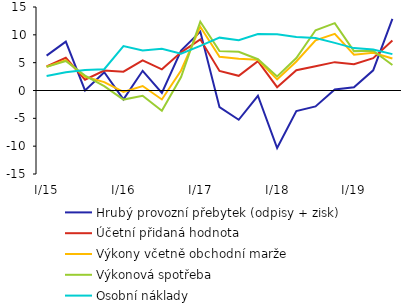
| Category | Hrubý provozní přebytek (odpisy + zisk)   | Účetní přidaná hodnota | Výkony včetně obchodní marže | Výkonová spotřeba | Osobní náklady |
|---|---|---|---|---|---|
|  I/15 | 6.258 | 4.33 | 4.267 | 4.242 | 2.6 |
|  II | 8.779 | 5.885 | 5.463 | 5.302 | 3.274 |
| III | 0.02 | 1.943 | 2.472 | 2.674 | 3.683 |
| IV | 3.287 | 3.585 | 1.515 | 0.78 | 3.819 |
|  I/16 | -1.596 | 3.373 | -0.248 | -1.632 | 7.994 |
| II | 3.541 | 5.412 | 0.805 | -0.957 | 7.192 |
| III | -0.43 | 3.809 | -1.61 | -3.654 | 7.507 |
| IV | 7.176 | 6.856 | 3.599 | 2.411 | 6.605 |
|  I/17 | 10.577 | 9.191 | 11.446 | 12.351 | 8.017 |
| II | -2.998 | 3.514 | 6.043 | 7.072 | 9.495 |
| III | -5.256 | 2.64 | 5.707 | 6.955 | 9.023 |
| IV | -0.947 | 5.258 | 5.522 | 5.622 | 10.132 |
|  I/18 | -10.337 | 0.599 | 1.991 | 2.534 | 10.085 |
| II | -3.694 | 3.634 | 5.204 | 5.821 | 9.596 |
| III | -2.864 | 4.356 | 9.007 | 10.822 | 9.428 |
| IV | 0.198 | 5.094 | 10.18 | 12.11 | 8.553 |
|  I/19 | 0.588 | 4.705 | 6.418 | 7.074 | 7.614 |
| II | 3.63 | 5.81 | 6.783 | 7.157 | 7.369 |
| III | 12.878 | 8.972 | 5.753 | 4.57 | 6.536 |